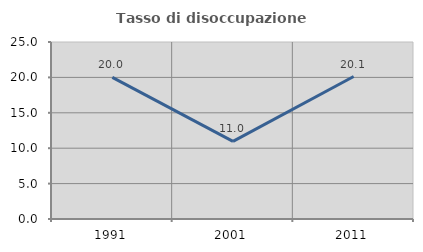
| Category | Tasso di disoccupazione giovanile  |
|---|---|
| 1991.0 | 20 |
| 2001.0 | 10.959 |
| 2011.0 | 20.126 |